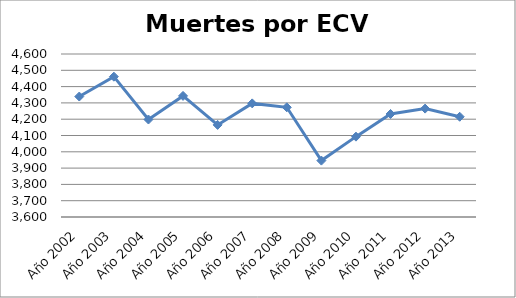
| Category | Series 0 |
|---|---|
| Año 2002 | 4339 |
| Año 2003 | 4461 |
| Año 2004 | 4198 |
| Año 2005 | 4343 |
| Año 2006 | 4165 |
| Año 2007 | 4297 |
| Año 2008 | 4273 |
| Año 2009 | 3946 |
| Año 2010 | 4093 |
| Año 2011 | 4232 |
| Año 2012 | 4265 |
| Año 2013 | 4215 |